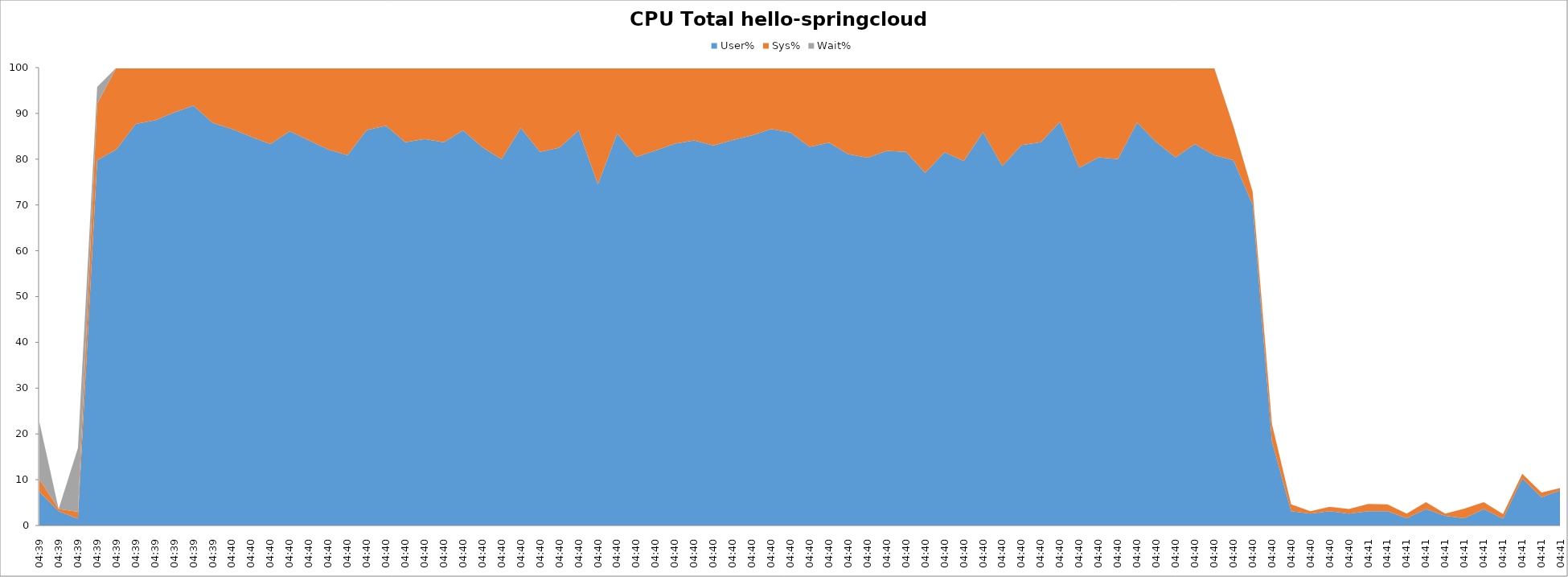
| Category | User% | Sys% | Wait% |
|---|---|---|---|
| 04:39 | 7.4 | 2.7 | 12.5 |
| 04:39 | 3.1 | 0.5 | 0 |
| 04:39 | 1.5 | 1.5 | 13.9 |
| 04:39 | 79.8 | 12.3 | 3.7 |
| 04:39 | 82.1 | 17.9 | 0 |
| 04:39 | 87.7 | 12.3 | 0 |
| 04:39 | 88.5 | 11.5 | 0 |
| 04:39 | 90.2 | 9.8 | 0 |
| 04:39 | 91.7 | 8.3 | 0 |
| 04:39 | 87.9 | 12.1 | 0 |
| 04:40 | 86.6 | 13.4 | 0 |
| 04:40 | 84.9 | 15.1 | 0 |
| 04:40 | 83.3 | 16.7 | 0 |
| 04:40 | 86.1 | 13.9 | 0 |
| 04:40 | 84.1 | 15.9 | 0 |
| 04:40 | 82.1 | 17.9 | 0 |
| 04:40 | 80.9 | 19.1 | 0 |
| 04:40 | 86.4 | 13.6 | 0 |
| 04:40 | 87.3 | 12.7 | 0 |
| 04:40 | 83.7 | 16.3 | 0 |
| 04:40 | 84.4 | 15.6 | 0 |
| 04:40 | 83.7 | 16.3 | 0 |
| 04:40 | 86.3 | 13.7 | 0 |
| 04:40 | 82.6 | 17.4 | 0 |
| 04:40 | 80 | 20 | 0 |
| 04:40 | 86.8 | 13.2 | 0 |
| 04:40 | 81.6 | 18.4 | 0 |
| 04:40 | 82.5 | 17.5 | 0 |
| 04:40 | 86.3 | 13.7 | 0 |
| 04:40 | 74.5 | 25.5 | 0 |
| 04:40 | 85.6 | 14.4 | 0 |
| 04:40 | 80.5 | 19.5 | 0 |
| 04:40 | 81.9 | 18.1 | 0 |
| 04:40 | 83.4 | 16.6 | 0 |
| 04:40 | 84.1 | 15.9 | 0 |
| 04:40 | 83 | 17 | 0 |
| 04:40 | 84.2 | 15.8 | 0 |
| 04:40 | 85.2 | 14.8 | 0 |
| 04:40 | 86.6 | 13.4 | 0 |
| 04:40 | 85.8 | 14.2 | 0 |
| 04:40 | 82.7 | 17.3 | 0 |
| 04:40 | 83.6 | 16.4 | 0 |
| 04:40 | 81.1 | 18.9 | 0 |
| 04:40 | 80.3 | 19.7 | 0 |
| 04:40 | 81.8 | 18.2 | 0 |
| 04:40 | 81.6 | 18.4 | 0 |
| 04:40 | 77 | 23 | 0 |
| 04:40 | 81.5 | 18.5 | 0 |
| 04:40 | 79.6 | 20.4 | 0 |
| 04:40 | 85.9 | 14.1 | 0 |
| 04:40 | 78.5 | 21.5 | 0 |
| 04:40 | 83.1 | 16.9 | 0 |
| 04:40 | 83.7 | 16.3 | 0 |
| 04:40 | 88.2 | 11.8 | 0 |
| 04:40 | 78.1 | 21.9 | 0 |
| 04:40 | 80.4 | 19.6 | 0 |
| 04:40 | 80 | 20 | 0 |
| 04:40 | 88 | 12 | 0 |
| 04:40 | 83.7 | 16.3 | 0 |
| 04:40 | 80.4 | 19.6 | 0 |
| 04:40 | 83.3 | 16.7 | 0 |
| 04:40 | 80.9 | 19.1 | 0 |
| 04:40 | 79.8 | 7.4 | 0 |
| 04:40 | 70.1 | 2.8 | 0 |
| 04:40 | 18.4 | 3.8 | 0 |
| 04:40 | 3.1 | 1.5 | 0 |
| 04:40 | 2.6 | 0.5 | 0 |
| 04:40 | 3.1 | 1 | 0 |
| 04:40 | 2.6 | 1 | 0 |
| 04:41 | 3.1 | 1.6 | 0 |
| 04:41 | 3.1 | 1.5 | 0 |
| 04:41 | 1.6 | 1 | 0 |
| 04:41 | 3.6 | 1.5 | 0 |
| 04:41 | 2.1 | 0.5 | 0 |
| 04:41 | 1.6 | 2.1 | 0 |
| 04:41 | 3.6 | 1.5 | 0 |
| 04:41 | 1.5 | 1 | 0 |
| 04:41 | 10.3 | 1 | 0 |
| 04:41 | 6.2 | 1 | 0 |
| 04:41 | 7.7 | 0.5 | 0 |